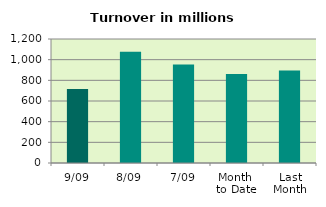
| Category | Series 0 |
|---|---|
| 9/09 | 715.528 |
| 8/09 | 1076.016 |
| 7/09 | 953.338 |
| Month 
to Date | 862.173 |
| Last
Month | 893.956 |